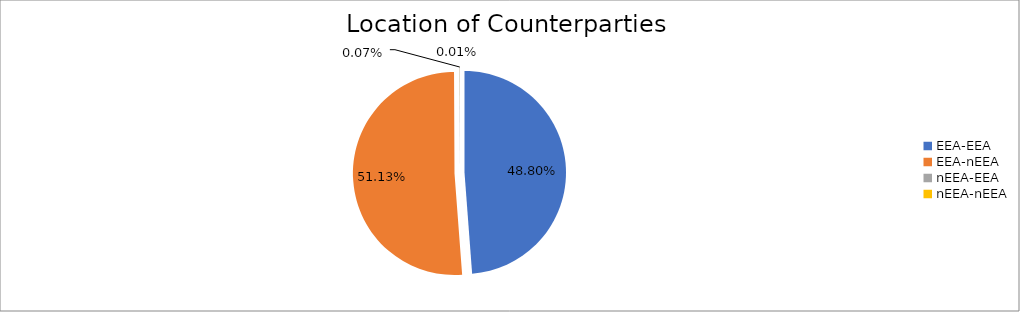
| Category | Series 0 |
|---|---|
| EEA-EEA | 5717102.367 |
| EEA-nEEA | 5989580.706 |
| nEEA-EEA | 7916.938 |
| nEEA-nEEA | 774.073 |